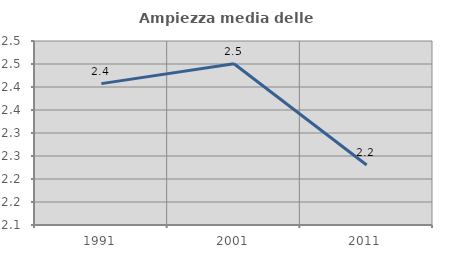
| Category | Ampiezza media delle famiglie |
|---|---|
| 1991.0 | 2.407 |
| 2001.0 | 2.45 |
| 2011.0 | 2.231 |